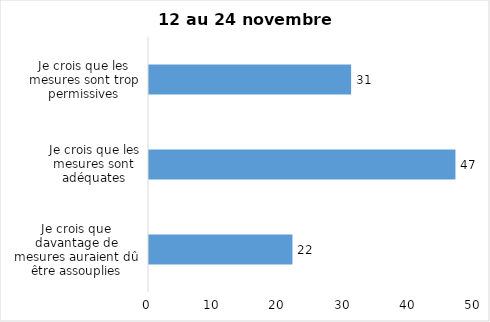
| Category | Series 0 |
|---|---|
| Je crois que davantage de mesures auraient dû être assouplies | 22 |
| Je crois que les mesures sont adéquates | 47 |
| Je crois que les mesures sont trop permissives | 31 |